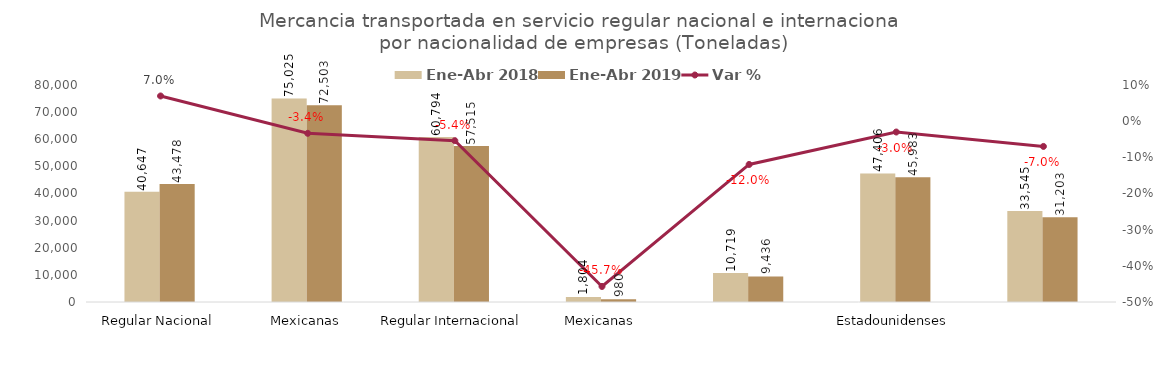
| Category | Ene-Abr 2018 | Ene-Abr 2019 |
|---|---|---|
| 0 | 40647.103 | 43477.749 |
| 1 | 75025.332 | 72502.885 |
| 2 | 60793.711 | 57514.585 |
| 3 | 1804.083 | 979.642 |
| 4 | 10719.143 | 9436.001 |
| 5 | 47405.898 | 45983.293 |
| 6 | 33545.479 | 31202.547 |